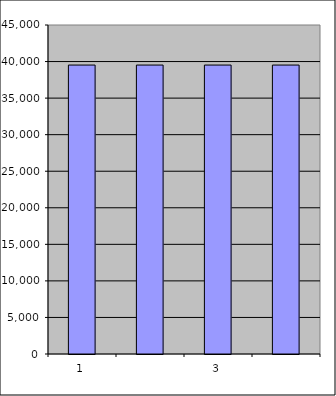
| Category | Series 0 |
|---|---|
| 0 | 39520.333 |
| 1 | 39520.333 |
| 2 | 39520.333 |
| 3 | 39520.333 |